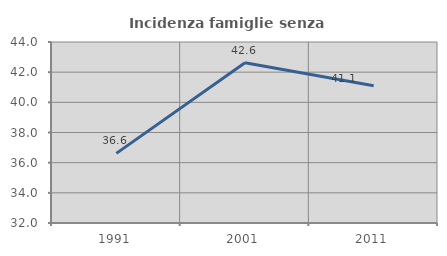
| Category | Incidenza famiglie senza nuclei |
|---|---|
| 1991.0 | 36.616 |
| 2001.0 | 42.619 |
| 2011.0 | 41.102 |